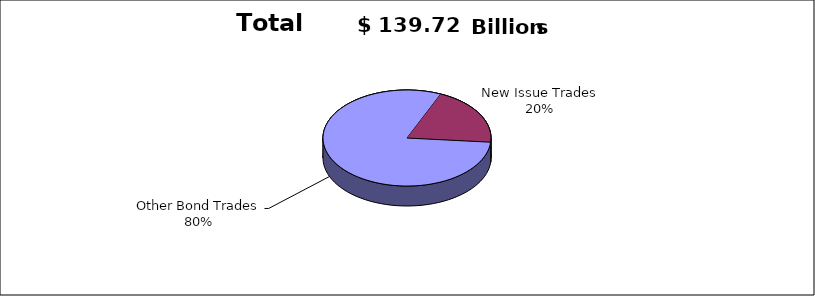
| Category | Series 0 |
|---|---|
| Other Bond Trades | 112040370024 |
| New Issue Trades | 27677727489 |